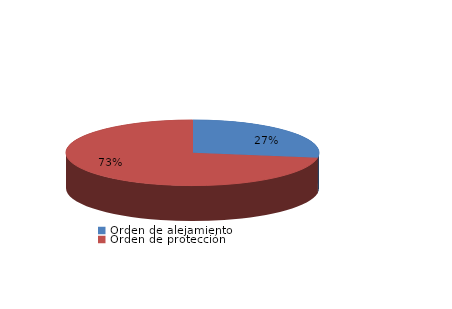
| Category | Series 0 |
|---|---|
| Orden de alejamiento | 17 |
| Orden de protección | 45 |